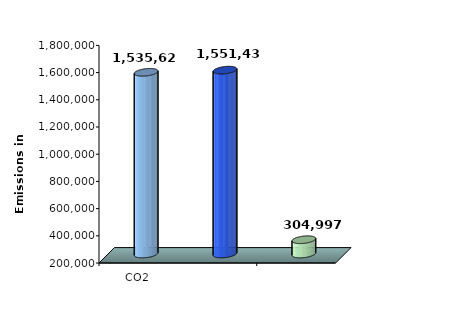
| Category | Series 0 |
|---|---|
| CO2 | 1535622 |